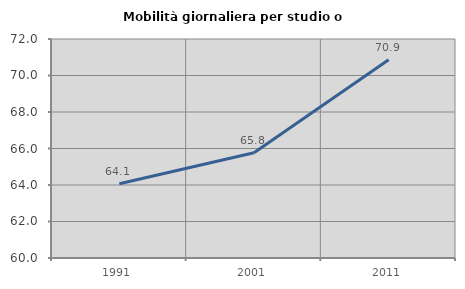
| Category | Mobilità giornaliera per studio o lavoro |
|---|---|
| 1991.0 | 64.07 |
| 2001.0 | 65.769 |
| 2011.0 | 70.862 |